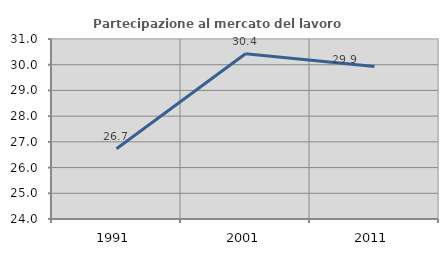
| Category | Partecipazione al mercato del lavoro  femminile |
|---|---|
| 1991.0 | 26.733 |
| 2001.0 | 30.425 |
| 2011.0 | 29.93 |